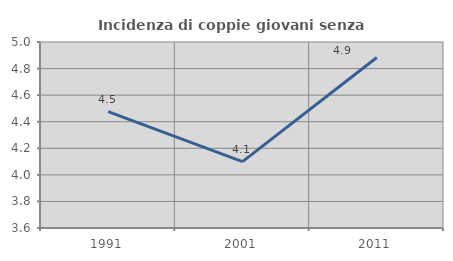
| Category | Incidenza di coppie giovani senza figli |
|---|---|
| 1991.0 | 4.476 |
| 2001.0 | 4.1 |
| 2011.0 | 4.883 |